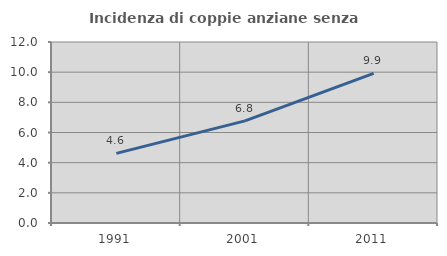
| Category | Incidenza di coppie anziane senza figli  |
|---|---|
| 1991.0 | 4.615 |
| 2001.0 | 6.77 |
| 2011.0 | 9.924 |